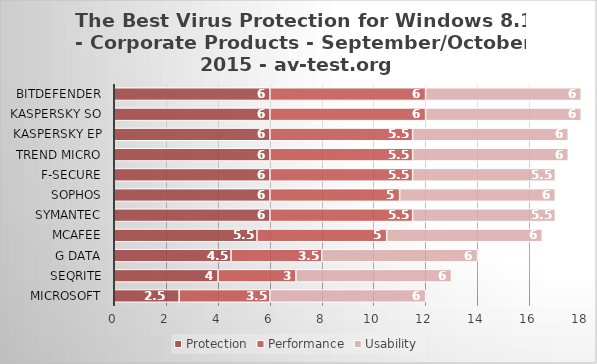
| Category | Protection | Performance | Usability |
|---|---|---|---|
| Microsoft | 2.5 | 3.5 | 6 |
| Seqrite | 4 | 3 | 6 |
| G Data | 4.5 | 3.5 | 6 |
| McAfee | 5.5 | 5 | 6 |
| Symantec | 6 | 5.5 | 5.5 |
| Sophos | 6 | 5 | 6 |
| F-Secure | 6 | 5.5 | 5.5 |
| Trend Micro | 6 | 5.5 | 6 |
| Kaspersky EP | 6 | 5.5 | 6 |
| Kaspersky SO | 6 | 6 | 6 |
| Bitdefender | 6 | 6 | 6 |